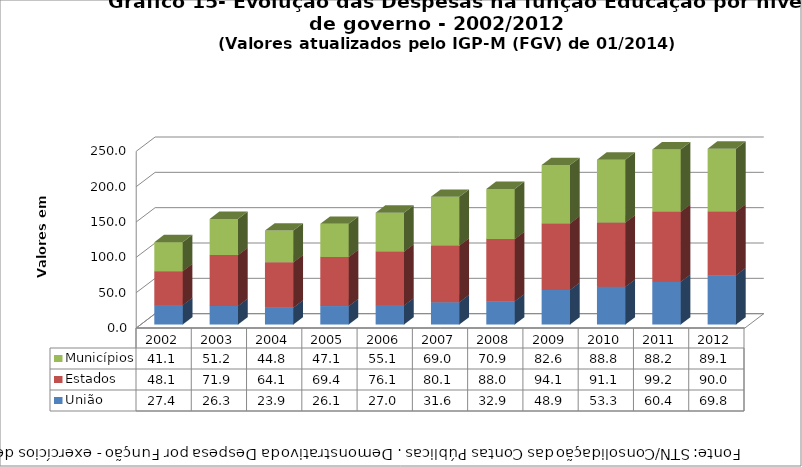
| Category | União | Estados | Municípios |
|---|---|---|---|
| 2002.0 | 27.399 | 48.076 | 41.053 |
| 2003.0 | 26.297 | 71.888 | 51.189 |
| 2004.0 | 23.93 | 64.145 | 44.796 |
| 2005.0 | 26.142 | 69.363 | 47.113 |
| 2006.0 | 27.049 | 76.113 | 55.075 |
| 2007.0 | 31.578 | 80.115 | 69.029 |
| 2008.0 | 32.911 | 88.027 | 70.857 |
| 2009.0 | 48.93 | 94.144 | 82.623 |
| 2010.0 | 53.302 | 91.065 | 88.833 |
| 2011.0 | 60.411 | 99.164 | 88.227 |
| 2012.0 | 69.778 | 89.996 | 89.099 |